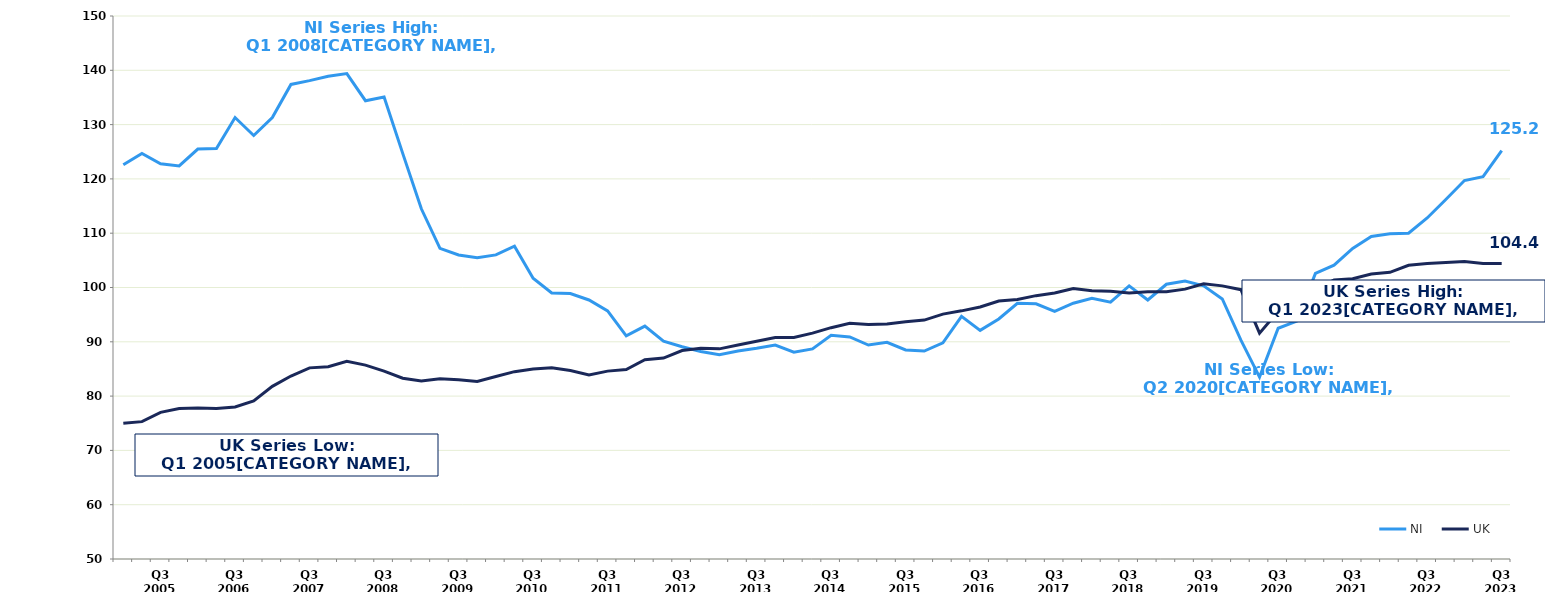
| Category | NI | UK |
|---|---|---|
|  | 122.6 | 75 |
|  | 124.7 | 75.3 |
| Q3 2005 | 122.8 | 77 |
|  | 122.4 | 77.7 |
|  | 125.5 | 77.8 |
|  | 125.6 | 77.7 |
| Q3 2006 | 131.3 | 78 |
|  | 128 | 79.1 |
|  | 131.3 | 81.8 |
|  | 137.4 | 83.7 |
| Q3 2007 | 138.1 | 85.2 |
|  | 138.9 | 85.4 |
|  | 139.4 | 86.4 |
|  | 134.4 | 85.7 |
| Q3 2008 | 135.1 | 84.6 |
|  | 124.7 | 83.3 |
|  | 114.5 | 82.8 |
|  | 107.2 | 83.2 |
| Q3 2009 | 106 | 83 |
|  | 105.5 | 82.7 |
|  | 106 | 83.6 |
|  | 107.6 | 84.5 |
| Q3 2010 | 101.7 | 85 |
|  | 99 | 85.2 |
|  | 98.9 | 84.7 |
|  | 97.7 | 83.9 |
| Q3 2011 | 95.7 | 84.6 |
|  | 91.1 | 84.9 |
|  | 92.9 | 86.7 |
|  | 90.1 | 87 |
| Q3 2012 | 89.1 | 88.4 |
|  | 88.2 | 88.8 |
|  | 87.6 | 88.7 |
|  | 88.3 | 89.4 |
| Q3 2013 | 88.8 | 90.1 |
|  | 89.4 | 90.8 |
|  | 88.1 | 90.8 |
|  | 88.7 | 91.6 |
| Q3 2014 | 91.2 | 92.6 |
|  | 90.9 | 93.4 |
|  | 89.4 | 93.2 |
|  | 89.9 | 93.3 |
| Q3 2015 | 88.5 | 93.7 |
|  | 88.3 | 94 |
|  | 89.8 | 95.1 |
|  | 94.7 | 95.7 |
| Q3 2016 | 92.1 | 96.4 |
|  | 94.2 | 97.5 |
|  | 97.1 | 97.8 |
|  | 97 | 98.5 |
| Q3 2017 | 95.6 | 99 |
|  | 97.1 | 99.8 |
|  | 98 | 99.4 |
|  | 97.3 | 99.3 |
| Q3 2018 | 100.3 | 99 |
|  | 97.7 | 99.2 |
|  | 100.6 | 99.2 |
|  | 101.2 | 99.7 |
| Q3 2019 | 100.3 | 100.7 |
|  | 97.9 | 100.3 |
|  | 90.3 | 99.6 |
|  | 83.5 | 91.6 |
| Q3 2020 | 92.5 | 95.6 |
|  | 93.8 | 98.2 |
|  | 102.6 | 99.7 |
|  | 104.1 | 101.4 |
| Q3 2021 | 107.2 | 101.6 |
|  | 109.4 | 102.5 |
|  | 109.9 | 102.8 |
|  | 110 | 104.1 |
| Q3 2022 | 112.8 | 104.4 |
|  | 116.2 | 104.6 |
|  | 119.7 | 104.8 |
|  | 120.4 | 104.4 |
| Q3 2023 | 125.2 | 104.4 |